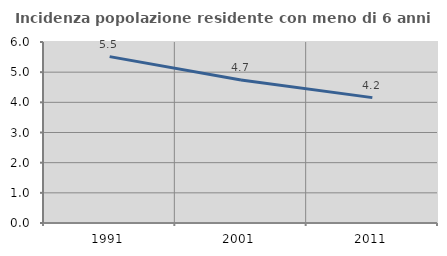
| Category | Incidenza popolazione residente con meno di 6 anni |
|---|---|
| 1991.0 | 5.516 |
| 2001.0 | 4.738 |
| 2011.0 | 4.156 |